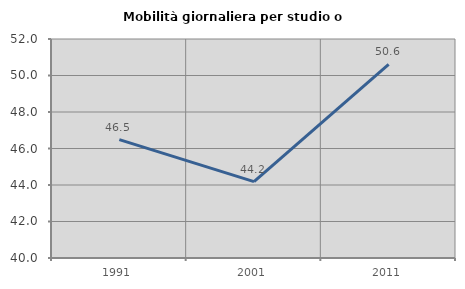
| Category | Mobilità giornaliera per studio o lavoro |
|---|---|
| 1991.0 | 46.489 |
| 2001.0 | 44.189 |
| 2011.0 | 50.609 |